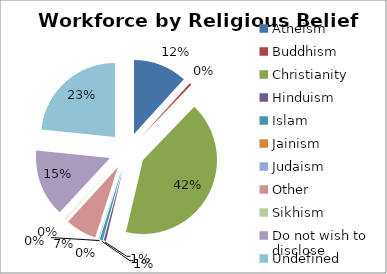
| Category | Series 0 |
|---|---|
| Atheism | 11.753 |
| Buddhism | 0.431 |
| Christianity | 41.522 |
| Hinduism | 0.502 |
| Islam | 0.664 |
| Jainism | 0.018 |
| Judaism | 0.108 |
| Other | 6.783 |
| Sikhism | 0.09 |
| Do not wish to disclose | 14.768 |
| Undefined | 23.363 |